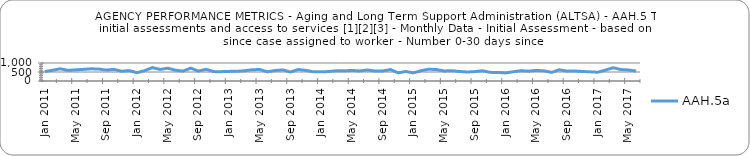
| Category | AAH.5a |
|---|---|
| 2011-01-01 | 526 |
| 2011-02-01 | 597 |
| 2011-03-01 | 678 |
| 2011-04-01 | 590 |
| 2011-05-01 | 619 |
| 2011-06-01 | 646 |
| 2011-07-01 | 678 |
| 2011-08-01 | 666 |
| 2011-09-01 | 605 |
| 2011-10-01 | 647 |
| 2011-11-01 | 542 |
| 2011-12-01 | 577 |
| 2012-01-01 | 459 |
| 2012-02-01 | 575 |
| 2012-03-01 | 744 |
| 2012-04-01 | 643 |
| 2012-05-01 | 709 |
| 2012-06-01 | 602 |
| 2012-07-01 | 550 |
| 2012-08-01 | 715 |
| 2012-09-01 | 550 |
| 2012-10-01 | 654 |
| 2012-11-01 | 521 |
| 2012-12-01 | 519 |
| 2013-01-01 | 534 |
| 2013-02-01 | 541 |
| 2013-03-01 | 570 |
| 2013-04-01 | 626 |
| 2013-05-01 | 638 |
| 2013-06-01 | 509 |
| 2013-07-01 | 585 |
| 2013-08-01 | 615 |
| 2013-09-01 | 499 |
| 2013-10-01 | 639 |
| 2013-11-01 | 589 |
| 2013-12-01 | 508 |
| 2014-01-01 | 508 |
| 2014-02-01 | 526 |
| 2014-03-01 | 572 |
| 2014-04-01 | 569 |
| 2014-05-01 | 585 |
| 2014-06-01 | 559 |
| 2014-07-01 | 609 |
| 2014-08-01 | 556 |
| 2014-09-01 | 555 |
| 2014-10-01 | 637 |
| 2014-11-01 | 456 |
| 2014-12-01 | 526 |
| 2015-01-01 | 454 |
| 2015-02-01 | 573 |
| 2015-03-01 | 655 |
| 2015-04-01 | 635 |
| 2015-05-01 | 558 |
| 2015-06-01 | 572 |
| 2015-07-01 | 528 |
| 2015-08-01 | 500 |
| 2015-09-01 | 522 |
| 2015-10-01 | 568 |
| 2015-11-01 | 480 |
| 2015-12-01 | 474 |
| 2016-01-01 | 448 |
| 2016-02-01 | 515 |
| 2016-03-01 | 572 |
| 2016-04-01 | 547 |
| 2016-05-01 | 590 |
| 2016-06-01 | 565 |
| 2016-07-01 | 480 |
| 2016-08-01 | 623 |
| 2016-09-01 | 548 |
| 2016-10-01 | 556 |
| 2016-11-01 | 530 |
| 2016-12-01 | 510 |
| 2017-01-01 | 487 |
| 2017-02-01 | 605 |
| 2017-03-01 | 736 |
| 2017-04-01 | 637 |
| 2017-05-01 | 613 |
| 2017-06-01 | 552 |